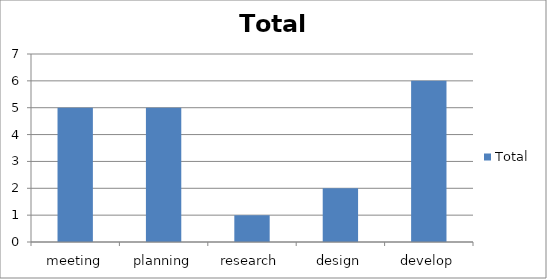
| Category | Total |
|---|---|
| meeting | 5 |
| planning | 5 |
| research | 1 |
| design | 2 |
| develop | 6 |